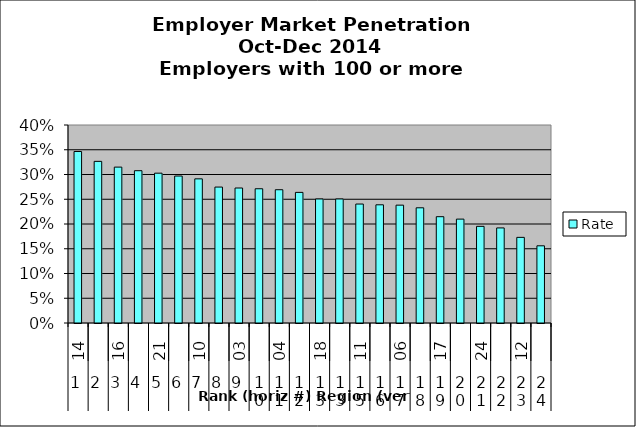
| Category | Rate |
|---|---|
| 0 | 0.346 |
| 1 | 0.327 |
| 2 | 0.315 |
| 3 | 0.308 |
| 4 | 0.303 |
| 5 | 0.297 |
| 6 | 0.291 |
| 7 | 0.275 |
| 8 | 0.273 |
| 9 | 0.271 |
| 10 | 0.269 |
| 11 | 0.264 |
| 12 | 0.251 |
| 13 | 0.251 |
| 14 | 0.24 |
| 15 | 0.239 |
| 16 | 0.238 |
| 17 | 0.233 |
| 18 | 0.215 |
| 19 | 0.21 |
| 20 | 0.195 |
| 21 | 0.192 |
| 22 | 0.173 |
| 23 | 0.156 |